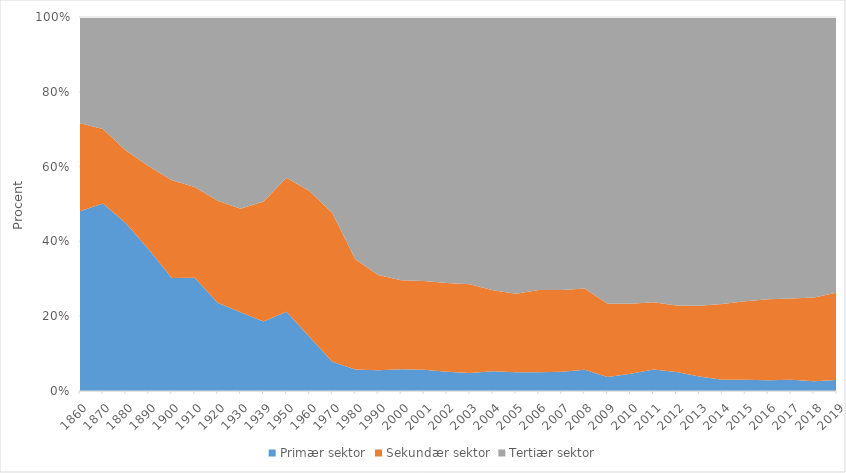
| Category | Primær sektor | Sekundær sektor | Tertiær sektor |
|---|---|---|---|
| 1860.0 | 48.091 | 23.517 | 28.393 |
| 1870.0 | 50.105 | 19.976 | 29.919 |
| 1880.0 | 44.86 | 19.44 | 35.7 |
| 1890.0 | 37.846 | 22.225 | 39.93 |
| 1900.0 | 30.182 | 26.172 | 43.646 |
| 1910.0 | 30.281 | 24.298 | 45.421 |
| 1920.0 | 23.58 | 27.258 | 49.162 |
| 1930.0 | 21.069 | 27.66 | 51.271 |
| 1939.0 | 18.58 | 32.078 | 49.342 |
| 1950.0 | 21.195 | 35.827 | 42.978 |
| 1960.0 | 14.508 | 38.958 | 46.534 |
| 1970.0 | 7.836 | 39.725 | 52.438 |
| 1980.0 | 5.757 | 29.499 | 64.744 |
| 1990.0 | 5.534 | 25.461 | 69.004 |
| 2000.0 | 5.801 | 23.834 | 70.364 |
| 2001.0 | 5.701 | 23.685 | 70.614 |
| 2002.0 | 5.136 | 23.727 | 71.12 |
| 2003.0 | 4.798 | 23.738 | 71.464 |
| 2004.0 | 5.25 | 21.663 | 73.087 |
| 2005.0 | 5 | 21 | 74 |
| 2006.0 | 5 | 22 | 73 |
| 2007.0 | 5.145 | 21.886 | 72.969 |
| 2008.0 | 5.652 | 21.735 | 72.613 |
| 2009.0 | 3.721 | 19.619 | 76.661 |
| 2010.0 | 4.63 | 18.673 | 76.697 |
| 2011.0 | 5.725 | 18.065 | 76.341 |
| 2012.0 | 5.052 | 17.811 | 77.137 |
| 2013.0 | 3.869 | 18.92 | 77.211 |
| 2014.0 | 3 | 20 | 76 |
| 2015.0 | 3 | 21 | 76 |
| 2016.0 | 2.875 | 21.627 | 75.498 |
| 2017.0 | 2.987 | 21.762 | 75.251 |
| 2018.0 | 2.6 | 22.419 | 74.981 |
| 2019.0 | 2.964 | 23.334 | 73.702 |